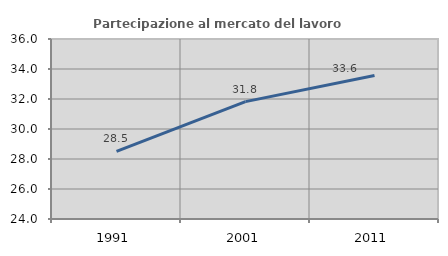
| Category | Partecipazione al mercato del lavoro  femminile |
|---|---|
| 1991.0 | 28.503 |
| 2001.0 | 31.825 |
| 2011.0 | 33.562 |